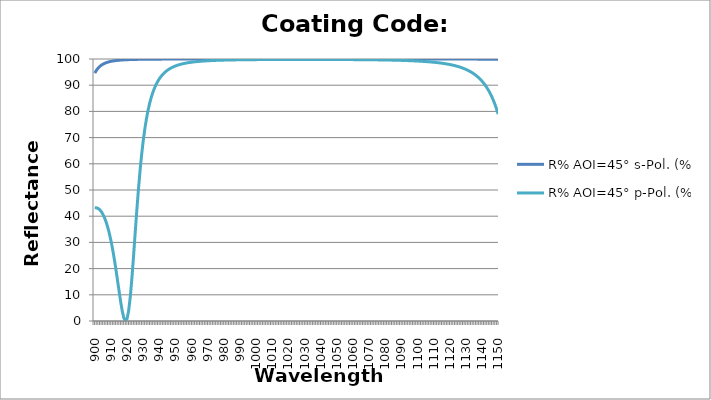
| Category | R% AOI=45° s-Pol. (%) | R% AOI=45° p-Pol. (%) |
|---|---|---|
| 900.0 | 94.621 | 43.174 |
| 901.0 | 95.682 | 43.196 |
| 902.0 | 96.494 | 42.98 |
| 903.0 | 97.123 | 42.512 |
| 904.0 | 97.617 | 41.779 |
| 905.0 | 98.009 | 40.762 |
| 906.0 | 98.324 | 39.441 |
| 907.0 | 98.578 | 37.796 |
| 908.0 | 98.786 | 35.801 |
| 909.0 | 98.957 | 33.434 |
| 910.0 | 99.098 | 30.675 |
| 911.0 | 99.217 | 27.514 |
| 912.0 | 99.316 | 23.959 |
| 913.0 | 99.4 | 20.048 |
| 914.0 | 99.472 | 15.868 |
| 915.0 | 99.533 | 11.578 |
| 916.0 | 99.585 | 7.434 |
| 917.0 | 99.63 | 3.805 |
| 918.0 | 99.669 | 1.167 |
| 919.0 | 99.703 | 0.044 |
| 920.0 | 99.733 | 0.907 |
| 921.0 | 99.759 | 4.021 |
| 922.0 | 99.782 | 9.33 |
| 923.0 | 99.802 | 16.435 |
| 924.0 | 99.82 | 24.697 |
| 925.0 | 99.836 | 33.414 |
| 926.0 | 99.85 | 41.979 |
| 927.0 | 99.862 | 49.962 |
| 928.0 | 99.873 | 57.128 |
| 929.0 | 99.884 | 63.39 |
| 930.0 | 99.892 | 68.766 |
| 931.0 | 99.901 | 73.326 |
| 932.0 | 99.908 | 77.17 |
| 933.0 | 99.915 | 80.399 |
| 934.0 | 99.921 | 83.109 |
| 935.0 | 99.926 | 85.386 |
| 936.0 | 99.931 | 87.302 |
| 937.0 | 99.936 | 88.92 |
| 938.0 | 99.94 | 90.291 |
| 939.0 | 99.944 | 91.457 |
| 940.0 | 99.947 | 92.452 |
| 941.0 | 99.95 | 93.305 |
| 942.0 | 99.953 | 94.039 |
| 943.0 | 99.956 | 94.673 |
| 944.0 | 99.958 | 95.223 |
| 945.0 | 99.961 | 95.701 |
| 946.0 | 99.963 | 96.12 |
| 947.0 | 99.965 | 96.486 |
| 948.0 | 99.967 | 96.808 |
| 949.0 | 99.968 | 97.093 |
| 950.0 | 99.97 | 97.345 |
| 951.0 | 99.971 | 97.569 |
| 952.0 | 99.973 | 97.768 |
| 953.0 | 99.974 | 97.946 |
| 954.0 | 99.975 | 98.105 |
| 955.0 | 99.976 | 98.248 |
| 956.0 | 99.977 | 98.376 |
| 957.0 | 99.978 | 98.492 |
| 958.0 | 99.979 | 98.597 |
| 959.0 | 99.98 | 98.692 |
| 960.0 | 99.981 | 98.779 |
| 961.0 | 99.982 | 98.857 |
| 962.0 | 99.982 | 98.929 |
| 963.0 | 99.983 | 98.994 |
| 964.0 | 99.984 | 99.054 |
| 965.0 | 99.984 | 99.108 |
| 966.0 | 99.985 | 99.159 |
| 967.0 | 99.985 | 99.205 |
| 968.0 | 99.986 | 99.247 |
| 969.0 | 99.986 | 99.287 |
| 970.0 | 99.987 | 99.323 |
| 971.0 | 99.987 | 99.356 |
| 972.0 | 99.987 | 99.387 |
| 973.0 | 99.988 | 99.416 |
| 974.0 | 99.988 | 99.443 |
| 975.0 | 99.988 | 99.467 |
| 976.0 | 99.989 | 99.49 |
| 977.0 | 99.989 | 99.512 |
| 978.0 | 99.989 | 99.532 |
| 979.0 | 99.99 | 99.551 |
| 980.0 | 99.99 | 99.568 |
| 981.0 | 99.99 | 99.584 |
| 982.0 | 99.99 | 99.6 |
| 983.0 | 99.991 | 99.614 |
| 984.0 | 99.991 | 99.627 |
| 985.0 | 99.991 | 99.64 |
| 986.0 | 99.991 | 99.652 |
| 987.0 | 99.991 | 99.663 |
| 988.0 | 99.992 | 99.673 |
| 989.0 | 99.992 | 99.683 |
| 990.0 | 99.992 | 99.692 |
| 991.0 | 99.992 | 99.701 |
| 992.0 | 99.992 | 99.709 |
| 993.0 | 99.992 | 99.716 |
| 994.0 | 99.992 | 99.724 |
| 995.0 | 99.992 | 99.73 |
| 996.0 | 99.993 | 99.737 |
| 997.0 | 99.993 | 99.743 |
| 998.0 | 99.993 | 99.749 |
| 999.0 | 99.993 | 99.754 |
| 1000.0 | 99.993 | 99.759 |
| 1001.0 | 99.993 | 99.764 |
| 1002.0 | 99.993 | 99.768 |
| 1003.0 | 99.993 | 99.772 |
| 1004.0 | 99.993 | 99.776 |
| 1005.0 | 99.994 | 99.78 |
| 1006.0 | 99.994 | 99.784 |
| 1007.0 | 99.994 | 99.787 |
| 1008.0 | 99.994 | 99.79 |
| 1009.0 | 99.994 | 99.793 |
| 1010.0 | 99.994 | 99.796 |
| 1011.0 | 99.994 | 99.798 |
| 1012.0 | 99.994 | 99.8 |
| 1013.0 | 99.994 | 99.803 |
| 1014.0 | 99.994 | 99.805 |
| 1015.0 | 99.994 | 99.807 |
| 1016.0 | 99.994 | 99.808 |
| 1017.0 | 99.994 | 99.81 |
| 1018.0 | 99.994 | 99.811 |
| 1019.0 | 99.994 | 99.813 |
| 1020.0 | 99.994 | 99.814 |
| 1021.0 | 99.994 | 99.815 |
| 1022.0 | 99.994 | 99.816 |
| 1023.0 | 99.994 | 99.816 |
| 1024.0 | 99.994 | 99.817 |
| 1025.0 | 99.994 | 99.818 |
| 1026.0 | 99.994 | 99.818 |
| 1027.0 | 99.994 | 99.819 |
| 1028.0 | 99.994 | 99.819 |
| 1029.0 | 99.994 | 99.819 |
| 1030.0 | 99.994 | 99.819 |
| 1031.0 | 99.994 | 99.819 |
| 1032.0 | 99.994 | 99.818 |
| 1033.0 | 99.994 | 99.818 |
| 1034.0 | 99.994 | 99.818 |
| 1035.0 | 99.994 | 99.817 |
| 1036.0 | 99.994 | 99.816 |
| 1037.0 | 99.994 | 99.816 |
| 1038.0 | 99.994 | 99.815 |
| 1039.0 | 99.994 | 99.814 |
| 1040.0 | 99.994 | 99.813 |
| 1041.0 | 99.994 | 99.812 |
| 1042.0 | 99.994 | 99.81 |
| 1043.0 | 99.994 | 99.809 |
| 1044.0 | 99.994 | 99.807 |
| 1045.0 | 99.994 | 99.805 |
| 1046.0 | 99.994 | 99.804 |
| 1047.0 | 99.994 | 99.802 |
| 1048.0 | 99.994 | 99.799 |
| 1049.0 | 99.994 | 99.797 |
| 1050.0 | 99.994 | 99.795 |
| 1051.0 | 99.994 | 99.792 |
| 1052.0 | 99.994 | 99.789 |
| 1053.0 | 99.994 | 99.787 |
| 1054.0 | 99.994 | 99.784 |
| 1055.0 | 99.994 | 99.78 |
| 1056.0 | 99.994 | 99.777 |
| 1057.0 | 99.993 | 99.774 |
| 1058.0 | 99.993 | 99.77 |
| 1059.0 | 99.993 | 99.766 |
| 1060.0 | 99.993 | 99.762 |
| 1061.0 | 99.993 | 99.757 |
| 1062.0 | 99.993 | 99.753 |
| 1063.0 | 99.993 | 99.748 |
| 1064.0 | 99.993 | 99.743 |
| 1065.0 | 99.993 | 99.738 |
| 1066.0 | 99.993 | 99.732 |
| 1067.0 | 99.993 | 99.726 |
| 1068.0 | 99.992 | 99.72 |
| 1069.0 | 99.992 | 99.714 |
| 1070.0 | 99.992 | 99.707 |
| 1071.0 | 99.992 | 99.7 |
| 1072.0 | 99.992 | 99.693 |
| 1073.0 | 99.992 | 99.685 |
| 1074.0 | 99.992 | 99.677 |
| 1075.0 | 99.992 | 99.668 |
| 1076.0 | 99.991 | 99.659 |
| 1077.0 | 99.991 | 99.65 |
| 1078.0 | 99.991 | 99.64 |
| 1079.0 | 99.991 | 99.63 |
| 1080.0 | 99.991 | 99.618 |
| 1081.0 | 99.991 | 99.607 |
| 1082.0 | 99.99 | 99.595 |
| 1083.0 | 99.99 | 99.582 |
| 1084.0 | 99.99 | 99.569 |
| 1085.0 | 99.99 | 99.554 |
| 1086.0 | 99.99 | 99.54 |
| 1087.0 | 99.989 | 99.524 |
| 1088.0 | 99.989 | 99.507 |
| 1089.0 | 99.989 | 99.49 |
| 1090.0 | 99.989 | 99.471 |
| 1091.0 | 99.988 | 99.452 |
| 1092.0 | 99.988 | 99.431 |
| 1093.0 | 99.988 | 99.41 |
| 1094.0 | 99.988 | 99.387 |
| 1095.0 | 99.987 | 99.362 |
| 1096.0 | 99.987 | 99.336 |
| 1097.0 | 99.987 | 99.309 |
| 1098.0 | 99.986 | 99.28 |
| 1099.0 | 99.986 | 99.25 |
| 1100.0 | 99.986 | 99.217 |
| 1101.0 | 99.985 | 99.182 |
| 1102.0 | 99.985 | 99.145 |
| 1103.0 | 99.984 | 99.106 |
| 1104.0 | 99.984 | 99.064 |
| 1105.0 | 99.983 | 99.02 |
| 1106.0 | 99.983 | 98.975 |
| 1107.0 | 99.982 | 98.926 |
| 1108.0 | 99.982 | 98.875 |
| 1109.0 | 99.982 | 98.82 |
| 1110.0 | 99.981 | 98.762 |
| 1111.0 | 99.98 | 98.699 |
| 1112.0 | 99.98 | 98.632 |
| 1113.0 | 99.979 | 98.561 |
| 1114.0 | 99.978 | 98.485 |
| 1115.0 | 99.978 | 98.403 |
| 1116.0 | 99.977 | 98.315 |
| 1117.0 | 99.976 | 98.22 |
| 1118.0 | 99.976 | 98.119 |
| 1119.0 | 99.975 | 98.01 |
| 1120.0 | 99.974 | 97.892 |
| 1121.0 | 99.973 | 97.766 |
| 1122.0 | 99.972 | 97.629 |
| 1123.0 | 99.971 | 97.481 |
| 1124.0 | 99.97 | 97.321 |
| 1125.0 | 99.969 | 97.148 |
| 1126.0 | 99.968 | 96.96 |
| 1127.0 | 99.967 | 96.757 |
| 1128.0 | 99.966 | 96.535 |
| 1129.0 | 99.964 | 96.294 |
| 1130.0 | 99.963 | 96.032 |
| 1131.0 | 99.962 | 95.745 |
| 1132.0 | 99.96 | 95.432 |
| 1133.0 | 99.959 | 95.089 |
| 1134.0 | 99.957 | 94.714 |
| 1135.0 | 99.955 | 94.302 |
| 1136.0 | 99.953 | 93.849 |
| 1137.0 | 99.951 | 93.35 |
| 1138.0 | 99.949 | 92.801 |
| 1139.0 | 99.947 | 92.195 |
| 1140.0 | 99.945 | 91.524 |
| 1141.0 | 99.942 | 90.782 |
| 1142.0 | 99.94 | 89.96 |
| 1143.0 | 99.937 | 89.046 |
| 1144.0 | 99.934 | 88.031 |
| 1145.0 | 99.931 | 86.901 |
| 1146.0 | 99.928 | 85.642 |
| 1147.0 | 99.925 | 84.237 |
| 1148.0 | 99.921 | 82.67 |
| 1149.0 | 99.917 | 80.92 |
| 1150.0 | 99.913 | 78.965 |